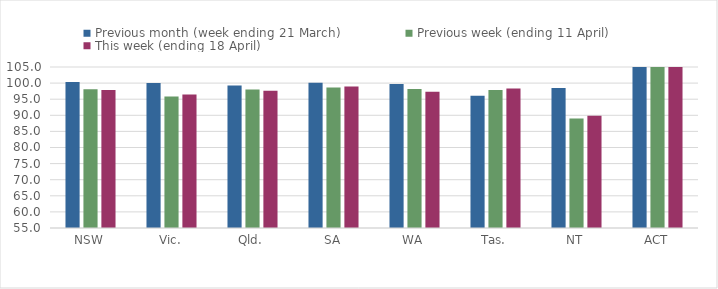
| Category | Previous month (week ending 21 March) | Previous week (ending 11 April) | This week (ending 18 April) |
|---|---|---|---|
| NSW | 100.351 | 98.07 | 97.885 |
| Vic. | 100 | 95.828 | 96.487 |
| Qld. | 99.262 | 97.997 | 97.653 |
| SA | 100.111 | 98.608 | 98.933 |
| WA | 99.72 | 98.165 | 97.302 |
| Tas. | 96.057 | 97.849 | 98.341 |
| NT | 98.488 | 88.985 | 89.864 |
| ACT | 115.789 | 113.158 | 113.737 |